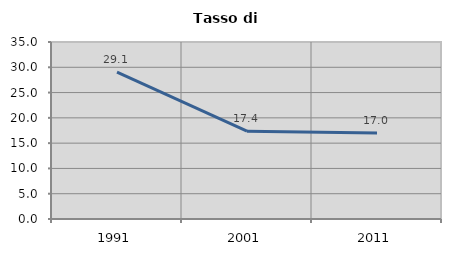
| Category | Tasso di disoccupazione   |
|---|---|
| 1991.0 | 29.052 |
| 2001.0 | 17.363 |
| 2011.0 | 17.023 |